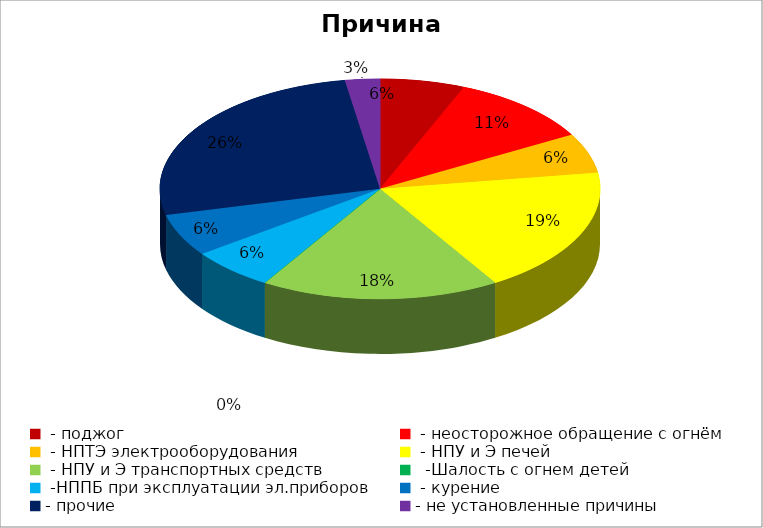
| Category | Причина пожара |
|---|---|
|  - поджог | 17 |
|  - неосторожное обращение с огнём | 29 |
|  - НПТЭ электрооборудования | 16 |
|  - НПУ и Э печей | 51 |
|  - НПУ и Э транспортных средств | 48 |
|   -Шалость с огнем детей | 0 |
|  -НППБ при эксплуатации эл.приборов | 17 |
|  - курение | 17 |
| - прочие | 72 |
| - не установленные причины | 7 |